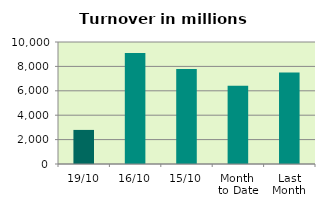
| Category | Series 0 |
|---|---|
| 19/10 | 2793.695 |
| 16/10 | 9099.999 |
| 15/10 | 7781.642 |
| Month 
to Date | 6406.983 |
| Last
Month | 7507.246 |